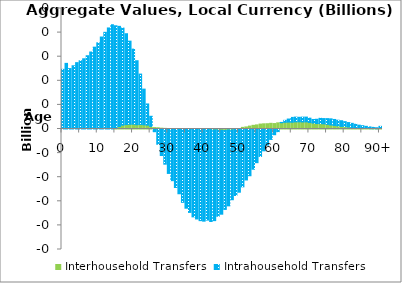
| Category | Interhousehold Transfers | Intrahousehold Transfers |
|---|---|---|
| 0 | 0 | 24.76 |
|  | 0 | 27.233 |
| 2 | 0 | 25.073 |
| 3 | 0 | 26.243 |
| 4 | 0 | 27.53 |
| 5 | 0 | 28.3 |
| 6 | 0 | 29.134 |
| 7 | 0 | 30.401 |
| 8 | 0 | 31.945 |
| 9 | 0 | 33.957 |
| 10 | 0 | 35.755 |
| 11 | 0 | 38.162 |
| 12 | 0 | 40.116 |
| 13 | 0 | 41.93 |
| 14 | 0 | 43.263 |
| 15 | 0.495 | 42.341 |
| 16 | 1.046 | 41.544 |
| 17 | 1.601 | 40.263 |
| 18 | 1.841 | 37.692 |
| 19 | 1.961 | 34.495 |
| 20 | 1.989 | 31.149 |
| 21 | 1.783 | 26.54 |
| 22 | 1.879 | 20.909 |
| 23 | 1.738 | 14.81 |
| 24 | 1.601 | 8.797 |
| 25 | 1.06 | 4.217 |
| 26 | 0.577 | -1.122 |
| 27 | 0.509 | -6.324 |
| 28 | 0.345 | -10.991 |
| 29 | 0.261 | -14.599 |
| 30 | 0.202 | -18.435 |
| 31 | 0.083 | -21.438 |
| 32 | 0.198 | -24.276 |
| 33 | 0.155 | -26.87 |
| 34 | 0.163 | -30.436 |
| 35 | 0.091 | -32.865 |
| 36 | -0.078 | -34.531 |
| 37 | 0.008 | -36.459 |
| 38 | -0.04 | -37.285 |
| 39 | 0.124 | -38.024 |
| 40 | -0.026 | -38.217 |
| 41 | -0.107 | -37.691 |
| 42 | -0.241 | -38.152 |
| 43 | -0.345 | -37.678 |
| 44 | -0.336 | -35.871 |
| 45 | -0.518 | -34.832 |
| 46 | -0.562 | -32.808 |
| 47 | -0.383 | -31.507 |
| 48 | -0.356 | -28.994 |
| 49 | -0.126 | -27.463 |
| 50 | 0.075 | -26.224 |
| 51 | 0.676 | -24.001 |
| 52 | 0.862 | -21.15 |
| 53 | 1.207 | -19.398 |
| 54 | 1.522 | -16.691 |
| 55 | 1.71 | -13.972 |
| 56 | 2.04 | -11.375 |
| 57 | 2.153 | -9.059 |
| 58 | 2.194 | -6.684 |
| 59 | 2.354 | -4.332 |
| 60 | 2.26 | -2.369 |
| 61 | 2.555 | -1.111 |
| 62 | 2.615 | 0.121 |
| 63 | 2.788 | 0.809 |
| 64 | 2.863 | 1.268 |
| 65 | 2.794 | 2.012 |
| 66 | 2.973 | 1.963 |
| 67 | 2.983 | 1.875 |
| 68 | 2.928 | 2 |
| 69 | 2.952 | 1.99 |
| 70 | 2.694 | 1.799 |
| 71 | 2.464 | 1.494 |
| 72 | 2.26 | 1.781 |
| 73 | 2.226 | 2.206 |
| 74 | 2.138 | 2.187 |
| 75 | 1.927 | 2.378 |
| 76 | 1.66 | 2.555 |
| 77 | 1.478 | 2.483 |
| 78 | 1.279 | 2.366 |
| 79 | 1.062 | 2.373 |
| 80 | 0.989 | 2.073 |
| 81 | 0.834 | 1.838 |
| 82 | 0.618 | 1.729 |
| 83 | 0.443 | 1.525 |
| 84 | 0.339 | 1.255 |
| 85 | 0.286 | 1.084 |
| 86 | 0.221 | 0.885 |
| 87 | 0.154 | 0.715 |
| 88 | 0.118 | 0.561 |
| 89 | 0.089 | 0.427 |
| 90+ | 0.187 | 0.915 |